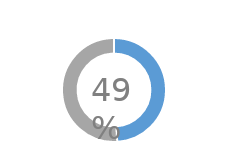
| Category | Series 0 |
|---|---|
| 0 | 0.49 |
| 1 | 0.51 |